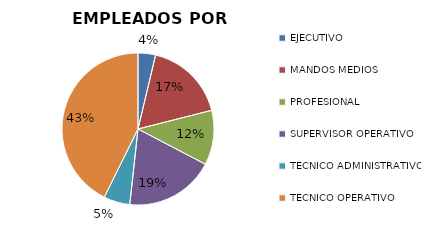
| Category | Series 0 |
|---|---|
| EJECUTIVO | 112 |
| MANDOS MEDIOS | 522 |
| PROFESIONAL | 350 |
| SUPERVISOR OPERATIVO | 574 |
| TECNICO ADMINISTRATIVO | 168 |
| TECNICO OPERATIVO | 1286 |